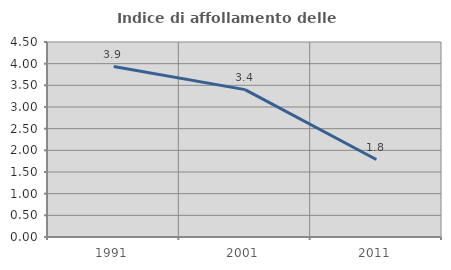
| Category | Indice di affollamento delle abitazioni  |
|---|---|
| 1991.0 | 3.934 |
| 2001.0 | 3.401 |
| 2011.0 | 1.788 |